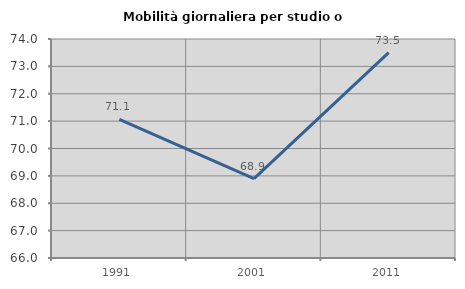
| Category | Mobilità giornaliera per studio o lavoro |
|---|---|
| 1991.0 | 71.063 |
| 2001.0 | 68.897 |
| 2011.0 | 73.502 |